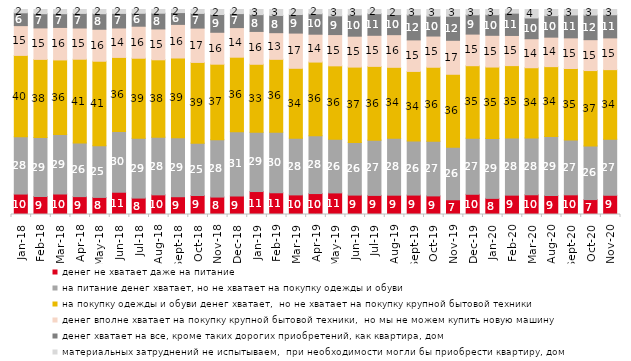
| Category | денег не хватает даже на питание | на питание денег хватает, но не хватает на покупку одежды и обуви | на покупку одежды и обуви денег хватает,  но не хватает на покупку крупной бытовой техники | денег вполне хватает на покупку крупной бытовой техники,  но мы не можем купить новую машину | денег хватает на все, кроме таких дорогих приобретений, как квартира, дом | материальных затруднений не испытываем,  при необходимости могли бы приобрести квартиру, дом |
|---|---|---|---|---|---|---|
| 2018-01-01 | 9.95 | 27.9 | 39.6 | 14.5 | 6.25 | 1.6 |
| 2018-02-01 | 8.75 | 28.65 | 38 | 15.3 | 6.9 | 2.05 |
| 2018-03-01 | 10 | 29.05 | 36.35 | 15.85 | 6.7 | 2.05 |
| 2018-04-01 | 8.7 | 26.1 | 40.75 | 15.2 | 7.1 | 1.9 |
| 2018-05-01 | 8.3 | 25.1 | 41.1 | 15.55 | 7.55 | 2.05 |
| 2018-06-01 | 10.85 | 29.6 | 36.1 | 14.35 | 7.1 | 1.9 |
| 2018-07-01 | 8 | 29.1 | 39.05 | 15.6 | 6.3 | 1.85 |
| 2018-08-01 | 9.55 | 28.05 | 37.6 | 15 | 7.65 | 1.8 |
| 2018-09-01 | 8.65 | 28.65 | 38.85 | 16.35 | 5.75 | 1.5 |
| 2018-10-01 | 9.25 | 25.45 | 39.3 | 16.7 | 7.15 | 1.9 |
| 2018-11-01 | 8.483 | 27.894 | 36.727 | 15.519 | 8.633 | 2.445 |
| 2018-12-01 | 9.05 | 31.2 | 36.25 | 14.4 | 6.8 | 2 |
| 2019-01-01 | 11.15 | 28.75 | 33.05 | 15.95 | 8.15 | 2.5 |
| 2019-02-01 | 10.6 | 29.5 | 35.55 | 13 | 8.4 | 2.9 |
| 2019-03-01 | 9.547 | 27.648 | 34.013 | 17.156 | 9.05 | 2.437 |
| 2019-04-01 | 10.198 | 28.119 | 35.891 | 13.564 | 9.95 | 2.079 |
| 2019-05-01 | 10.5 | 26.053 | 35.711 | 15.206 | 9.113 | 3.071 |
| 2019-06-01 | 9.426 | 25.536 | 36.658 | 15.012 | 10.324 | 2.643 |
| 2019-07-01 | 9.307 | 26.931 | 35.941 | 15.149 | 10.545 | 2.03 |
| 2019-08-01 | 9.391 | 27.722 | 34.466 | 15.884 | 9.79 | 2.448 |
| 2019-09-01 | 9.455 | 26.337 | 33.861 | 15.347 | 12.178 | 2.624 |
| 2019-10-01 | 9.059 | 26.584 | 36.04 | 15.198 | 9.703 | 3.218 |
| 2019-11-01 | 7.178 | 25.545 | 35.545 | 16.535 | 11.733 | 3.267 |
| 2019-12-01 | 9.851 | 27.327 | 35.297 | 15.396 | 9.406 | 2.574 |
| 2020-01-01 | 7.822 | 29.109 | 34.604 | 15.396 | 10 | 2.525 |
| 2020-02-01 | 9.406 | 27.772 | 35.198 | 14.653 | 10.842 | 1.782 |
| 2020-03-01 | 9.569 | 27.566 | 34.06 | 14.08 | 10.064 | 4.115 |
| 2020-08-01 | 9.235 | 28.699 | 34.012 | 14.35 | 10.477 | 2.979 |
| 2020-09-01 | 9.557 | 26.68 | 34.744 | 14.883 | 11.15 | 2.638 |
| 2020-10-01 | 7.275 | 26.109 | 36.721 | 15.047 | 12.008 | 2.691 |
| 2020-11-01 | 9.35 | 27.25 | 33.85 | 15.45 | 11.25 | 2.55 |